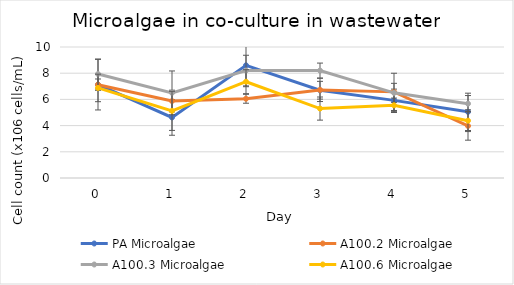
| Category | PA Microalgae | A100.2 Microalgae | A100.3 Microalgae | A100.6 Microalgae |
|---|---|---|---|---|
| 0.0 | 7.125 | 7.125 | 7.938 | 6.875 |
| 1.0 | 4.625 | 5.875 | 6.5 | 5.125 |
| 2.0 | 8.6 | 6.05 | 8.2 | 7.35 |
| 3.0 | 6.7 | 6.725 | 8.2 | 5.3 |
| 4.0 | 5.925 | 6.575 | 6.5 | 5.55 |
| 5.0 | 5.05 | 3.975 | 5.675 | 4.375 |